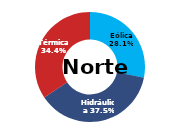
| Category | Norte |
|---|---|
| Eólica | 100.27 |
| Hidráulica | 133.69 |
| Solar | 0 |
| Térmica | 122.508 |